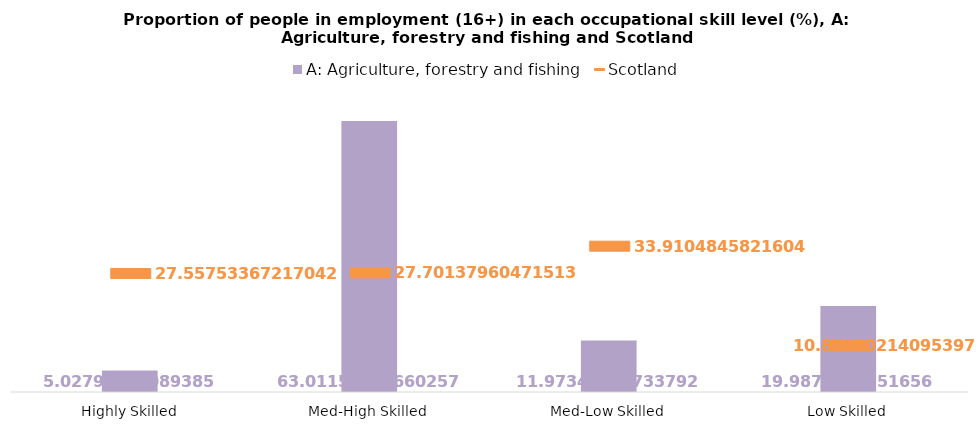
| Category | A: Agriculture, forestry and fishing |
|---|---|
| Highly Skilled | 5.028 |
| Med-High Skilled | 63.012 |
| Med-Low Skilled | 11.973 |
| Low Skilled | 19.987 |